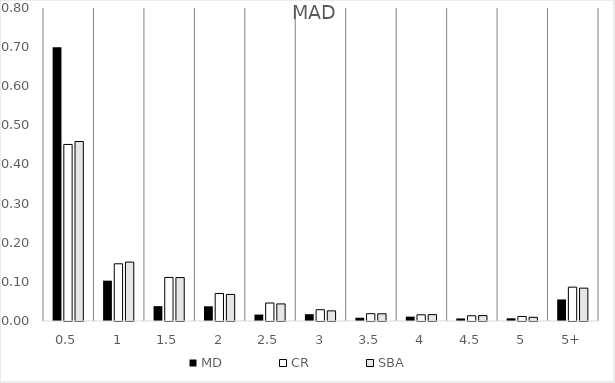
| Category | MD | CR | SBA |
|---|---|---|---|
| 0,5 | 0.699 | 0.451 | 0.459 |
| 1 | 0.103 | 0.146 | 0.151 |
| 1,5 | 0.038 | 0.111 | 0.111 |
| 2 | 0.038 | 0.07 | 0.068 |
| 2,5 | 0.016 | 0.046 | 0.044 |
| 3 | 0.017 | 0.029 | 0.026 |
| 3,5 | 0.008 | 0.019 | 0.018 |
| 4 | 0.011 | 0.016 | 0.016 |
| 4,5 | 0.006 | 0.013 | 0.014 |
| 5 | 0.007 | 0.012 | 0.009 |
| 5+ | 0.055 | 0.087 | 0.084 |